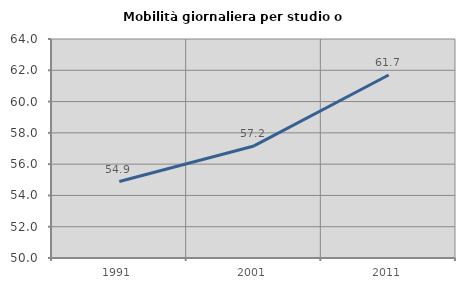
| Category | Mobilità giornaliera per studio o lavoro |
|---|---|
| 1991.0 | 54.889 |
| 2001.0 | 57.164 |
| 2011.0 | 61.698 |